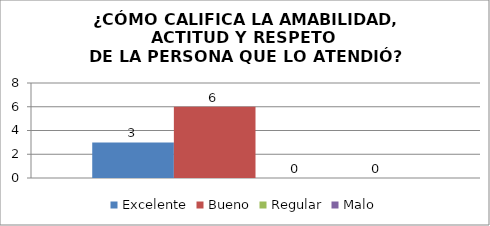
| Category | Excelente | Bueno | Regular | Malo |
|---|---|---|---|---|
| 0 | 3 | 6 | 0 | 0 |